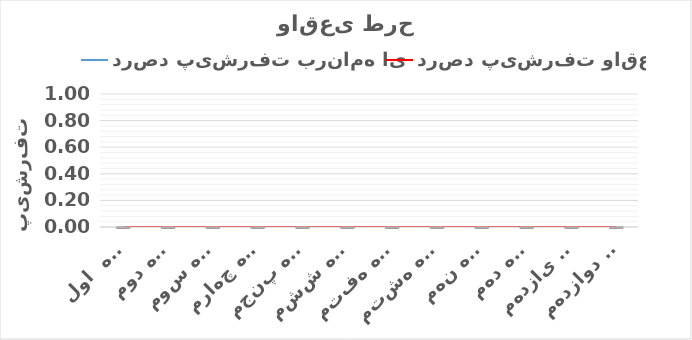
| Category | درصد پیشرفت برنامه ای  | درصد پیشرفت واقعی |
|---|---|---|
| ماه  اول | 0 | 0 |
| ماه دوم | 0 | 0 |
| ماه سوم | 0 | 0 |
| ماه چهارم | 0 | 0 |
| ماه پنجم | 0 | 0 |
| ماه ششم | 0 | 0 |
| ماه هفتم | 0 | 0 |
| ماه هشتم | 0 | 0 |
| ماه نهم | 0 | 0 |
| ماه دهم | 0 | 0 |
| ماه یازدهم | 0 | 0 |
| ماه دوازدهم | 0 | 0 |